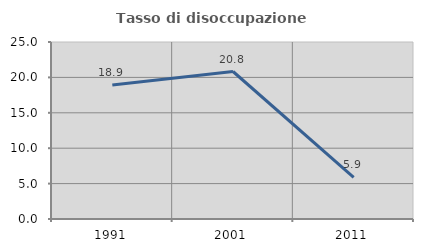
| Category | Tasso di disoccupazione giovanile  |
|---|---|
| 1991.0 | 18.919 |
| 2001.0 | 20.833 |
| 2011.0 | 5.882 |